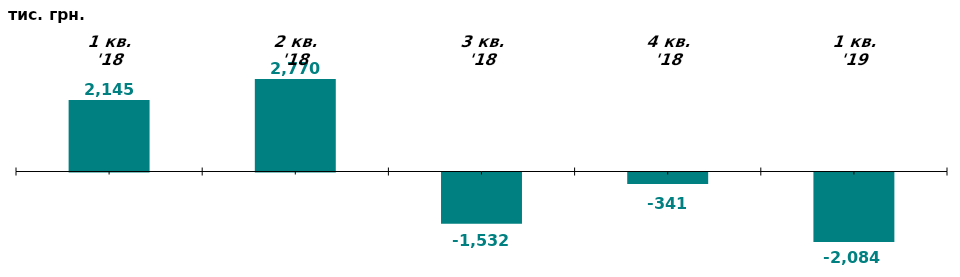
| Category | Чистий притік/відтік капіталу у 1-му кв. 2018-19 рр., тис. грн. |
|---|---|
| 1 кв. '18 | 2145.214 |
| 2 кв. '18 | 2770.106 |
| 3 кв. '18 | -1531.644 |
| 4 кв. '18 | -341.206 |
| 1 кв. '19 | -2083.653 |